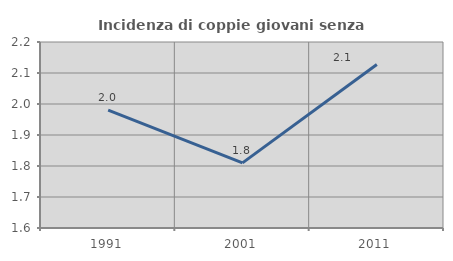
| Category | Incidenza di coppie giovani senza figli |
|---|---|
| 1991.0 | 1.98 |
| 2001.0 | 1.81 |
| 2011.0 | 2.128 |